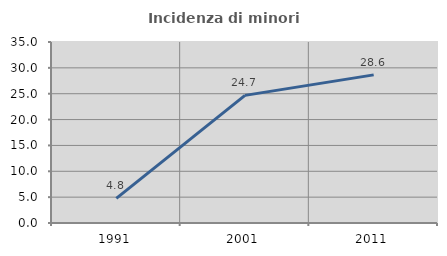
| Category | Incidenza di minori stranieri |
|---|---|
| 1991.0 | 4.762 |
| 2001.0 | 24.675 |
| 2011.0 | 28.645 |